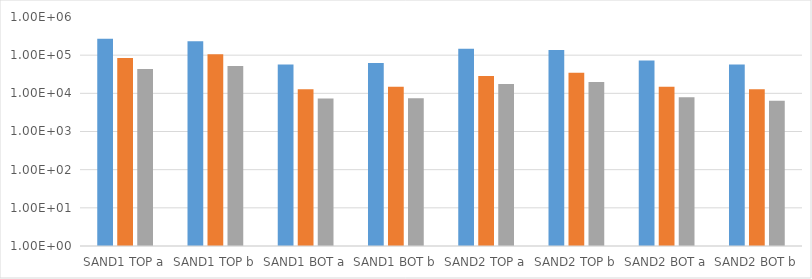
| Category | 1:100 | 1:500 | 1:1000 |
|---|---|---|---|
| SAND1 TOP a | 271200 | 83776.667 | 43266.667 |
| SAND1 TOP b | 232766.667 | 105975 | 51876.667 |
| SAND1 BOT a | 56790 | 12866.667 | 7287.333 |
| SAND1 BOT b | 61880 | 14846.667 | 7453.333 |
| SAND2 TOP a | 147400 | 28510 | 17610 |
| SAND2 TOP b | 137233.333 | 34673.333 | 19686.667 |
| SAND2 BOT a | 72533.333 | 14903.333 | 7862.667 |
| SAND2 BOT b | 56890 | 12726.667 | 6352.5 |